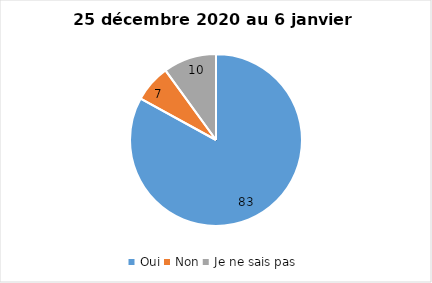
| Category | Series 0 |
|---|---|
| Oui | 83 |
| Non | 7 |
| Je ne sais pas | 10 |